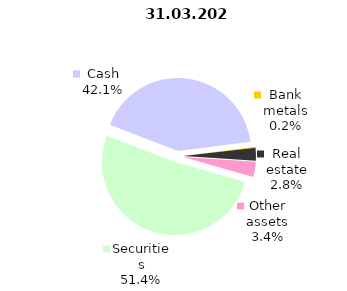
| Category | 31.03.2020 |
|---|---|
| Securities | 1597.5 |
| Cash | 1307.5 |
| Bank metals | 7.6 |
| Real estate | 88.5 |
| Other assets | 105.4 |